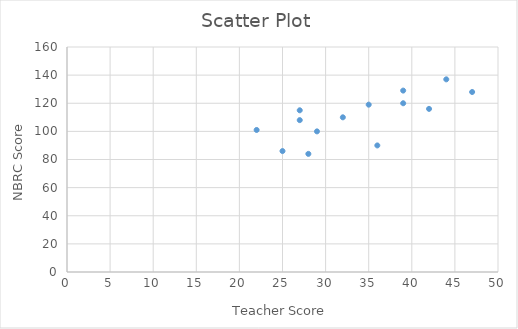
| Category | NBRC Score |
|---|---|
| 39.0 | 120 |
| 25.0 | 86 |
| 44.0 | 137 |
| 27.0 | 108 |
| 35.0 | 119 |
| 29.0 | 100 |
| 28.0 | 84 |
| 22.0 | 101 |
| 32.0 | 110 |
| 47.0 | 128 |
| 42.0 | 116 |
| 36.0 | 90 |
| 27.0 | 115 |
| 39.0 | 129 |